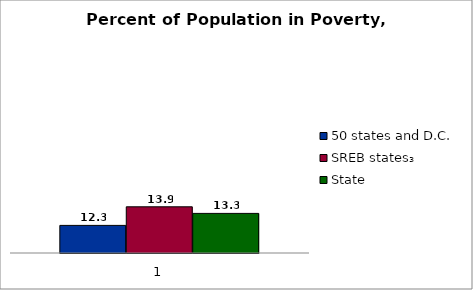
| Category | 50 states and D.C. | SREB states₃ | State |
|---|---|---|---|
| 0 | 12.3 | 13.85 | 13.3 |